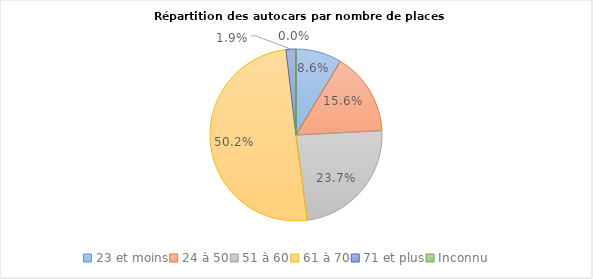
| Category | Series 0 |
|---|---|
| 23 et moins | 5740 |
| 24 à 50 | 10364 |
| 51 à 60 | 15800 |
| 61 à 70 | 33446 |
| 71 et plus | 1238 |
| Inconnu | 8 |